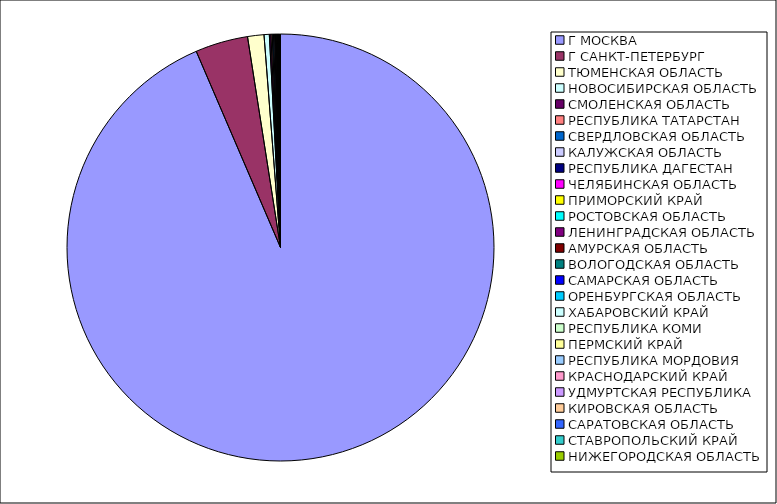
| Category | Оборот |
|---|---|
| Г МОСКВА | 0.935 |
| Г САНКТ-ПЕТЕРБУРГ | 0.04 |
| ТЮМЕНСКАЯ ОБЛАСТЬ | 0.012 |
| НОВОСИБИРСКАЯ ОБЛАСТЬ | 0.004 |
| СМОЛЕНСКАЯ ОБЛАСТЬ | 0.001 |
| РЕСПУБЛИКА ТАТАРСТАН | 0.001 |
| СВЕРДЛОВСКАЯ ОБЛАСТЬ | 0.001 |
| КАЛУЖСКАЯ ОБЛАСТЬ | 0.001 |
| РЕСПУБЛИКА ДАГЕСТАН | 0.001 |
| ЧЕЛЯБИНСКАЯ ОБЛАСТЬ | 0.001 |
| ПРИМОРСКИЙ КРАЙ | 0 |
| РОСТОВСКАЯ ОБЛАСТЬ | 0 |
| ЛЕНИНГРАДСКАЯ ОБЛАСТЬ | 0 |
| АМУРСКАЯ ОБЛАСТЬ | 0 |
| ВОЛОГОДСКАЯ ОБЛАСТЬ | 0 |
| САМАРСКАЯ ОБЛАСТЬ | 0 |
| ОРЕНБУРГСКАЯ ОБЛАСТЬ | 0 |
| ХАБАРОВСКИЙ КРАЙ | 0 |
| РЕСПУБЛИКА КОМИ | 0 |
| ПЕРМСКИЙ КРАЙ | 0 |
| РЕСПУБЛИКА МОРДОВИЯ | 0 |
| КРАСНОДАРСКИЙ КРАЙ | 0 |
| УДМУРТСКАЯ РЕСПУБЛИКА | 0 |
| КИРОВСКАЯ ОБЛАСТЬ | 0 |
| САРАТОВСКАЯ ОБЛАСТЬ | 0 |
| СТАВРОПОЛЬСКИЙ КРАЙ | 0 |
| НИЖЕГОРОДСКАЯ ОБЛАСТЬ | 0 |